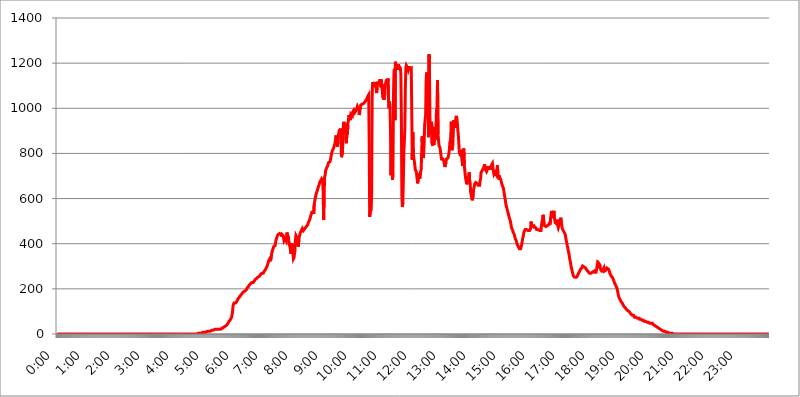
| Category | 2015.06.29. Intenzitás [W/m^2] |
|---|---|
| 0.0 | 0 |
| 0.0006944444444444445 | 0 |
| 0.001388888888888889 | 0 |
| 0.0020833333333333333 | 0 |
| 0.002777777777777778 | 0 |
| 0.003472222222222222 | 0 |
| 0.004166666666666667 | 0 |
| 0.004861111111111111 | 0 |
| 0.005555555555555556 | 0 |
| 0.0062499999999999995 | 0 |
| 0.006944444444444444 | 0 |
| 0.007638888888888889 | 0 |
| 0.008333333333333333 | 0 |
| 0.009027777777777779 | 0 |
| 0.009722222222222222 | 0 |
| 0.010416666666666666 | 0 |
| 0.011111111111111112 | 0 |
| 0.011805555555555555 | 0 |
| 0.012499999999999999 | 0 |
| 0.013194444444444444 | 0 |
| 0.013888888888888888 | 0 |
| 0.014583333333333332 | 0 |
| 0.015277777777777777 | 0 |
| 0.015972222222222224 | 0 |
| 0.016666666666666666 | 0 |
| 0.017361111111111112 | 0 |
| 0.018055555555555557 | 0 |
| 0.01875 | 0 |
| 0.019444444444444445 | 0 |
| 0.02013888888888889 | 0 |
| 0.020833333333333332 | 0 |
| 0.02152777777777778 | 0 |
| 0.022222222222222223 | 0 |
| 0.02291666666666667 | 0 |
| 0.02361111111111111 | 0 |
| 0.024305555555555556 | 0 |
| 0.024999999999999998 | 0 |
| 0.025694444444444447 | 0 |
| 0.02638888888888889 | 0 |
| 0.027083333333333334 | 0 |
| 0.027777777777777776 | 0 |
| 0.02847222222222222 | 0 |
| 0.029166666666666664 | 0 |
| 0.029861111111111113 | 0 |
| 0.030555555555555555 | 0 |
| 0.03125 | 0 |
| 0.03194444444444445 | 0 |
| 0.03263888888888889 | 0 |
| 0.03333333333333333 | 0 |
| 0.034027777777777775 | 0 |
| 0.034722222222222224 | 0 |
| 0.035416666666666666 | 0 |
| 0.036111111111111115 | 0 |
| 0.03680555555555556 | 0 |
| 0.0375 | 0 |
| 0.03819444444444444 | 0 |
| 0.03888888888888889 | 0 |
| 0.03958333333333333 | 0 |
| 0.04027777777777778 | 0 |
| 0.04097222222222222 | 0 |
| 0.041666666666666664 | 0 |
| 0.042361111111111106 | 0 |
| 0.04305555555555556 | 0 |
| 0.043750000000000004 | 0 |
| 0.044444444444444446 | 0 |
| 0.04513888888888889 | 0 |
| 0.04583333333333334 | 0 |
| 0.04652777777777778 | 0 |
| 0.04722222222222222 | 0 |
| 0.04791666666666666 | 0 |
| 0.04861111111111111 | 0 |
| 0.049305555555555554 | 0 |
| 0.049999999999999996 | 0 |
| 0.05069444444444445 | 0 |
| 0.051388888888888894 | 0 |
| 0.052083333333333336 | 0 |
| 0.05277777777777778 | 0 |
| 0.05347222222222222 | 0 |
| 0.05416666666666667 | 0 |
| 0.05486111111111111 | 0 |
| 0.05555555555555555 | 0 |
| 0.05625 | 0 |
| 0.05694444444444444 | 0 |
| 0.057638888888888885 | 0 |
| 0.05833333333333333 | 0 |
| 0.05902777777777778 | 0 |
| 0.059722222222222225 | 0 |
| 0.06041666666666667 | 0 |
| 0.061111111111111116 | 0 |
| 0.06180555555555556 | 0 |
| 0.0625 | 0 |
| 0.06319444444444444 | 0 |
| 0.06388888888888888 | 0 |
| 0.06458333333333334 | 0 |
| 0.06527777777777778 | 0 |
| 0.06597222222222222 | 0 |
| 0.06666666666666667 | 0 |
| 0.06736111111111111 | 0 |
| 0.06805555555555555 | 0 |
| 0.06874999999999999 | 0 |
| 0.06944444444444443 | 0 |
| 0.07013888888888889 | 0 |
| 0.07083333333333333 | 0 |
| 0.07152777777777779 | 0 |
| 0.07222222222222223 | 0 |
| 0.07291666666666667 | 0 |
| 0.07361111111111111 | 0 |
| 0.07430555555555556 | 0 |
| 0.075 | 0 |
| 0.07569444444444444 | 0 |
| 0.0763888888888889 | 0 |
| 0.07708333333333334 | 0 |
| 0.07777777777777778 | 0 |
| 0.07847222222222222 | 0 |
| 0.07916666666666666 | 0 |
| 0.0798611111111111 | 0 |
| 0.08055555555555556 | 0 |
| 0.08125 | 0 |
| 0.08194444444444444 | 0 |
| 0.08263888888888889 | 0 |
| 0.08333333333333333 | 0 |
| 0.08402777777777777 | 0 |
| 0.08472222222222221 | 0 |
| 0.08541666666666665 | 0 |
| 0.08611111111111112 | 0 |
| 0.08680555555555557 | 0 |
| 0.08750000000000001 | 0 |
| 0.08819444444444445 | 0 |
| 0.08888888888888889 | 0 |
| 0.08958333333333333 | 0 |
| 0.09027777777777778 | 0 |
| 0.09097222222222222 | 0 |
| 0.09166666666666667 | 0 |
| 0.09236111111111112 | 0 |
| 0.09305555555555556 | 0 |
| 0.09375 | 0 |
| 0.09444444444444444 | 0 |
| 0.09513888888888888 | 0 |
| 0.09583333333333333 | 0 |
| 0.09652777777777777 | 0 |
| 0.09722222222222222 | 0 |
| 0.09791666666666667 | 0 |
| 0.09861111111111111 | 0 |
| 0.09930555555555555 | 0 |
| 0.09999999999999999 | 0 |
| 0.10069444444444443 | 0 |
| 0.1013888888888889 | 0 |
| 0.10208333333333335 | 0 |
| 0.10277777777777779 | 0 |
| 0.10347222222222223 | 0 |
| 0.10416666666666667 | 0 |
| 0.10486111111111111 | 0 |
| 0.10555555555555556 | 0 |
| 0.10625 | 0 |
| 0.10694444444444444 | 0 |
| 0.1076388888888889 | 0 |
| 0.10833333333333334 | 0 |
| 0.10902777777777778 | 0 |
| 0.10972222222222222 | 0 |
| 0.1111111111111111 | 0 |
| 0.11180555555555556 | 0 |
| 0.11180555555555556 | 0 |
| 0.1125 | 0 |
| 0.11319444444444444 | 0 |
| 0.11388888888888889 | 0 |
| 0.11458333333333333 | 0 |
| 0.11527777777777777 | 0 |
| 0.11597222222222221 | 0 |
| 0.11666666666666665 | 0 |
| 0.1173611111111111 | 0 |
| 0.11805555555555557 | 0 |
| 0.11944444444444445 | 0 |
| 0.12013888888888889 | 0 |
| 0.12083333333333333 | 0 |
| 0.12152777777777778 | 0 |
| 0.12222222222222223 | 0 |
| 0.12291666666666667 | 0 |
| 0.12291666666666667 | 0 |
| 0.12361111111111112 | 0 |
| 0.12430555555555556 | 0 |
| 0.125 | 0 |
| 0.12569444444444444 | 0 |
| 0.12638888888888888 | 0 |
| 0.12708333333333333 | 0 |
| 0.16875 | 0 |
| 0.12847222222222224 | 0 |
| 0.12916666666666668 | 0 |
| 0.12986111111111112 | 0 |
| 0.13055555555555556 | 0 |
| 0.13125 | 0 |
| 0.13194444444444445 | 0 |
| 0.1326388888888889 | 0 |
| 0.13333333333333333 | 0 |
| 0.13402777777777777 | 0 |
| 0.13402777777777777 | 0 |
| 0.13472222222222222 | 0 |
| 0.13541666666666666 | 0 |
| 0.1361111111111111 | 0 |
| 0.13749999999999998 | 0 |
| 0.13819444444444443 | 0 |
| 0.1388888888888889 | 0 |
| 0.13958333333333334 | 0 |
| 0.14027777777777778 | 0 |
| 0.14097222222222222 | 0 |
| 0.14166666666666666 | 0 |
| 0.1423611111111111 | 0 |
| 0.14305555555555557 | 0 |
| 0.14375000000000002 | 0 |
| 0.14444444444444446 | 0 |
| 0.1451388888888889 | 0 |
| 0.1451388888888889 | 0 |
| 0.14652777777777778 | 0 |
| 0.14722222222222223 | 0 |
| 0.14791666666666667 | 0 |
| 0.1486111111111111 | 0 |
| 0.14930555555555555 | 0 |
| 0.15 | 0 |
| 0.15069444444444444 | 0 |
| 0.15138888888888888 | 0 |
| 0.15208333333333332 | 0 |
| 0.15277777777777776 | 0 |
| 0.15347222222222223 | 0 |
| 0.15416666666666667 | 0 |
| 0.15486111111111112 | 0 |
| 0.15555555555555556 | 0 |
| 0.15625 | 0 |
| 0.15694444444444444 | 0 |
| 0.15763888888888888 | 0 |
| 0.15833333333333333 | 0 |
| 0.15902777777777777 | 0 |
| 0.15972222222222224 | 0 |
| 0.16041666666666668 | 0 |
| 0.16111111111111112 | 0 |
| 0.16180555555555556 | 0 |
| 0.1625 | 0 |
| 0.16319444444444445 | 0 |
| 0.1638888888888889 | 0 |
| 0.16458333333333333 | 0 |
| 0.16527777777777777 | 0 |
| 0.16597222222222222 | 0 |
| 0.16666666666666666 | 0 |
| 0.1673611111111111 | 0 |
| 0.16805555555555554 | 0 |
| 0.16874999999999998 | 0 |
| 0.16944444444444443 | 0 |
| 0.17013888888888887 | 0 |
| 0.1708333333333333 | 0 |
| 0.17152777777777775 | 0 |
| 0.17222222222222225 | 0 |
| 0.1729166666666667 | 0 |
| 0.17361111111111113 | 0 |
| 0.17430555555555557 | 0 |
| 0.17500000000000002 | 0 |
| 0.17569444444444446 | 0 |
| 0.1763888888888889 | 0 |
| 0.17708333333333334 | 0 |
| 0.17777777777777778 | 0 |
| 0.17847222222222223 | 0 |
| 0.17916666666666667 | 0 |
| 0.1798611111111111 | 0 |
| 0.18055555555555555 | 0 |
| 0.18125 | 0 |
| 0.18194444444444444 | 0 |
| 0.1826388888888889 | 0 |
| 0.18333333333333335 | 0 |
| 0.1840277777777778 | 0 |
| 0.18472222222222223 | 0 |
| 0.18541666666666667 | 0 |
| 0.18611111111111112 | 0 |
| 0.18680555555555556 | 0 |
| 0.1875 | 0 |
| 0.18819444444444444 | 0 |
| 0.18888888888888888 | 0 |
| 0.18958333333333333 | 0 |
| 0.19027777777777777 | 0 |
| 0.1909722222222222 | 0 |
| 0.19166666666666665 | 0 |
| 0.19236111111111112 | 0 |
| 0.19305555555555554 | 0 |
| 0.19375 | 0 |
| 0.19444444444444445 | 0 |
| 0.1951388888888889 | 3.525 |
| 0.19583333333333333 | 0 |
| 0.19652777777777777 | 3.525 |
| 0.19722222222222222 | 3.525 |
| 0.19791666666666666 | 3.525 |
| 0.1986111111111111 | 3.525 |
| 0.19930555555555554 | 3.525 |
| 0.19999999999999998 | 3.525 |
| 0.20069444444444443 | 3.525 |
| 0.20138888888888887 | 3.525 |
| 0.2020833333333333 | 3.525 |
| 0.2027777777777778 | 3.525 |
| 0.2034722222222222 | 3.525 |
| 0.2041666666666667 | 7.887 |
| 0.20486111111111113 | 3.525 |
| 0.20555555555555557 | 7.887 |
| 0.20625000000000002 | 7.887 |
| 0.20694444444444446 | 7.887 |
| 0.2076388888888889 | 7.887 |
| 0.20833333333333334 | 7.887 |
| 0.20902777777777778 | 7.887 |
| 0.20972222222222223 | 7.887 |
| 0.21041666666666667 | 12.257 |
| 0.2111111111111111 | 12.257 |
| 0.21180555555555555 | 12.257 |
| 0.2125 | 12.257 |
| 0.21319444444444444 | 12.257 |
| 0.2138888888888889 | 12.257 |
| 0.21458333333333335 | 12.257 |
| 0.2152777777777778 | 16.636 |
| 0.21597222222222223 | 16.636 |
| 0.21666666666666667 | 16.636 |
| 0.21736111111111112 | 16.636 |
| 0.21805555555555556 | 16.636 |
| 0.21875 | 16.636 |
| 0.21944444444444444 | 21.024 |
| 0.22013888888888888 | 21.024 |
| 0.22083333333333333 | 21.024 |
| 0.22152777777777777 | 21.024 |
| 0.2222222222222222 | 21.024 |
| 0.22291666666666665 | 21.024 |
| 0.2236111111111111 | 21.024 |
| 0.22430555555555556 | 21.024 |
| 0.225 | 21.024 |
| 0.22569444444444445 | 21.024 |
| 0.2263888888888889 | 21.024 |
| 0.22708333333333333 | 21.024 |
| 0.22777777777777777 | 21.024 |
| 0.22847222222222222 | 21.024 |
| 0.22916666666666666 | 21.024 |
| 0.2298611111111111 | 21.024 |
| 0.23055555555555554 | 25.419 |
| 0.23124999999999998 | 25.419 |
| 0.23194444444444443 | 29.823 |
| 0.23263888888888887 | 29.823 |
| 0.2333333333333333 | 29.823 |
| 0.2340277777777778 | 29.823 |
| 0.2347222222222222 | 29.823 |
| 0.2354166666666667 | 34.234 |
| 0.23611111111111113 | 34.234 |
| 0.23680555555555557 | 38.653 |
| 0.23750000000000002 | 38.653 |
| 0.23819444444444446 | 43.079 |
| 0.2388888888888889 | 43.079 |
| 0.23958333333333334 | 47.511 |
| 0.24027777777777778 | 51.951 |
| 0.24097222222222223 | 56.398 |
| 0.24166666666666667 | 56.398 |
| 0.2423611111111111 | 60.85 |
| 0.24305555555555555 | 65.31 |
| 0.24375 | 65.31 |
| 0.24444444444444446 | 74.246 |
| 0.24513888888888888 | 83.205 |
| 0.24583333333333335 | 96.682 |
| 0.2465277777777778 | 123.758 |
| 0.24722222222222223 | 132.814 |
| 0.24791666666666667 | 137.347 |
| 0.24861111111111112 | 137.347 |
| 0.24930555555555556 | 137.347 |
| 0.25 | 137.347 |
| 0.25069444444444444 | 137.347 |
| 0.2513888888888889 | 141.884 |
| 0.2520833333333333 | 146.423 |
| 0.25277777777777777 | 150.964 |
| 0.2534722222222222 | 155.509 |
| 0.25416666666666665 | 155.509 |
| 0.2548611111111111 | 160.056 |
| 0.2555555555555556 | 164.605 |
| 0.25625000000000003 | 164.605 |
| 0.2569444444444445 | 169.156 |
| 0.2576388888888889 | 173.709 |
| 0.25833333333333336 | 173.709 |
| 0.2590277777777778 | 178.264 |
| 0.25972222222222224 | 182.82 |
| 0.2604166666666667 | 182.82 |
| 0.2611111111111111 | 182.82 |
| 0.26180555555555557 | 187.378 |
| 0.2625 | 187.378 |
| 0.26319444444444445 | 187.378 |
| 0.2638888888888889 | 191.937 |
| 0.26458333333333334 | 191.937 |
| 0.2652777777777778 | 196.497 |
| 0.2659722222222222 | 201.058 |
| 0.26666666666666666 | 205.62 |
| 0.2673611111111111 | 205.62 |
| 0.26805555555555555 | 210.182 |
| 0.26875 | 214.746 |
| 0.26944444444444443 | 214.746 |
| 0.2701388888888889 | 219.309 |
| 0.2708333333333333 | 219.309 |
| 0.27152777777777776 | 223.873 |
| 0.2722222222222222 | 223.873 |
| 0.27291666666666664 | 228.436 |
| 0.2736111111111111 | 228.436 |
| 0.2743055555555555 | 228.436 |
| 0.27499999999999997 | 228.436 |
| 0.27569444444444446 | 233 |
| 0.27638888888888885 | 233 |
| 0.27708333333333335 | 237.564 |
| 0.2777777777777778 | 242.127 |
| 0.27847222222222223 | 242.127 |
| 0.2791666666666667 | 242.127 |
| 0.2798611111111111 | 246.689 |
| 0.28055555555555556 | 246.689 |
| 0.28125 | 251.251 |
| 0.28194444444444444 | 251.251 |
| 0.2826388888888889 | 251.251 |
| 0.2833333333333333 | 255.813 |
| 0.28402777777777777 | 255.813 |
| 0.2847222222222222 | 260.373 |
| 0.28541666666666665 | 264.932 |
| 0.28611111111111115 | 264.932 |
| 0.28680555555555554 | 269.49 |
| 0.28750000000000003 | 269.49 |
| 0.2881944444444445 | 269.49 |
| 0.2888888888888889 | 269.49 |
| 0.28958333333333336 | 274.047 |
| 0.2902777777777778 | 278.603 |
| 0.29097222222222224 | 278.603 |
| 0.2916666666666667 | 283.156 |
| 0.2923611111111111 | 287.709 |
| 0.29305555555555557 | 292.259 |
| 0.29375 | 296.808 |
| 0.29444444444444445 | 301.354 |
| 0.2951388888888889 | 310.44 |
| 0.29583333333333334 | 314.98 |
| 0.2965277777777778 | 324.052 |
| 0.2972222222222222 | 328.584 |
| 0.29791666666666666 | 333.113 |
| 0.2986111111111111 | 333.113 |
| 0.29930555555555555 | 328.584 |
| 0.3 | 333.113 |
| 0.30069444444444443 | 355.712 |
| 0.3013888888888889 | 364.728 |
| 0.3020833333333333 | 373.729 |
| 0.30277777777777776 | 378.224 |
| 0.3034722222222222 | 387.202 |
| 0.30416666666666664 | 387.202 |
| 0.3048611111111111 | 387.202 |
| 0.3055555555555555 | 391.685 |
| 0.30624999999999997 | 405.108 |
| 0.3069444444444444 | 418.492 |
| 0.3076388888888889 | 422.943 |
| 0.30833333333333335 | 431.833 |
| 0.3090277777777778 | 431.833 |
| 0.30972222222222223 | 440.702 |
| 0.3104166666666667 | 445.129 |
| 0.3111111111111111 | 445.129 |
| 0.31180555555555556 | 445.129 |
| 0.3125 | 440.702 |
| 0.31319444444444444 | 445.129 |
| 0.3138888888888889 | 440.702 |
| 0.3145833333333333 | 431.833 |
| 0.31527777777777777 | 440.702 |
| 0.3159722222222222 | 445.129 |
| 0.31666666666666665 | 436.27 |
| 0.31736111111111115 | 427.39 |
| 0.31805555555555554 | 414.035 |
| 0.31875000000000003 | 418.492 |
| 0.3194444444444445 | 422.943 |
| 0.3201388888888889 | 422.943 |
| 0.32083333333333336 | 414.035 |
| 0.3215277777777778 | 431.833 |
| 0.32222222222222224 | 449.551 |
| 0.3229166666666667 | 449.551 |
| 0.3236111111111111 | 453.968 |
| 0.32430555555555557 | 422.943 |
| 0.325 | 396.164 |
| 0.32569444444444445 | 405.108 |
| 0.3263888888888889 | 387.202 |
| 0.32708333333333334 | 369.23 |
| 0.3277777777777778 | 355.712 |
| 0.3284722222222222 | 369.23 |
| 0.32916666666666666 | 400.638 |
| 0.3298611111111111 | 378.224 |
| 0.33055555555555555 | 355.712 |
| 0.33125 | 333.113 |
| 0.33194444444444443 | 337.639 |
| 0.3326388888888889 | 351.198 |
| 0.3333333333333333 | 369.23 |
| 0.3340277777777778 | 414.035 |
| 0.3347222222222222 | 436.27 |
| 0.3354166666666667 | 431.833 |
| 0.3361111111111111 | 422.943 |
| 0.3368055555555556 | 422.943 |
| 0.33749999999999997 | 405.108 |
| 0.33819444444444446 | 387.202 |
| 0.33888888888888885 | 422.943 |
| 0.33958333333333335 | 431.833 |
| 0.34027777777777773 | 431.833 |
| 0.34097222222222223 | 449.551 |
| 0.3416666666666666 | 453.968 |
| 0.3423611111111111 | 458.38 |
| 0.3430555555555555 | 458.38 |
| 0.34375 | 467.187 |
| 0.3444444444444445 | 462.786 |
| 0.3451388888888889 | 458.38 |
| 0.3458333333333334 | 462.786 |
| 0.34652777777777777 | 462.786 |
| 0.34722222222222227 | 467.187 |
| 0.34791666666666665 | 471.582 |
| 0.34861111111111115 | 471.582 |
| 0.34930555555555554 | 475.972 |
| 0.35000000000000003 | 480.356 |
| 0.3506944444444444 | 480.356 |
| 0.3513888888888889 | 484.735 |
| 0.3520833333333333 | 493.475 |
| 0.3527777777777778 | 497.836 |
| 0.3534722222222222 | 502.192 |
| 0.3541666666666667 | 506.542 |
| 0.3548611111111111 | 515.223 |
| 0.35555555555555557 | 523.88 |
| 0.35625 | 528.2 |
| 0.35694444444444445 | 536.82 |
| 0.3576388888888889 | 545.416 |
| 0.35833333333333334 | 532.513 |
| 0.3590277777777778 | 545.416 |
| 0.3597222222222222 | 532.513 |
| 0.36041666666666666 | 575.299 |
| 0.3611111111111111 | 588.009 |
| 0.36180555555555555 | 600.661 |
| 0.3625 | 613.252 |
| 0.36319444444444443 | 621.613 |
| 0.3638888888888889 | 625.784 |
| 0.3645833333333333 | 634.105 |
| 0.3652777777777778 | 642.4 |
| 0.3659722222222222 | 646.537 |
| 0.3666666666666667 | 654.791 |
| 0.3673611111111111 | 663.019 |
| 0.3680555555555556 | 671.22 |
| 0.36874999999999997 | 675.311 |
| 0.36944444444444446 | 679.395 |
| 0.37013888888888885 | 683.473 |
| 0.37083333333333335 | 687.544 |
| 0.37152777777777773 | 691.608 |
| 0.37222222222222223 | 679.395 |
| 0.3729166666666666 | 634.105 |
| 0.3736111111111111 | 506.542 |
| 0.3743055555555555 | 613.252 |
| 0.375 | 695.666 |
| 0.3756944444444445 | 703.762 |
| 0.3763888888888889 | 723.889 |
| 0.3770833333333334 | 727.896 |
| 0.37777777777777777 | 735.89 |
| 0.37847222222222227 | 735.89 |
| 0.37916666666666665 | 743.859 |
| 0.37986111111111115 | 751.803 |
| 0.38055555555555554 | 759.723 |
| 0.38125000000000003 | 759.723 |
| 0.3819444444444444 | 759.723 |
| 0.3826388888888889 | 763.674 |
| 0.3833333333333333 | 775.492 |
| 0.3840277777777778 | 787.258 |
| 0.3847222222222222 | 798.974 |
| 0.3854166666666667 | 806.757 |
| 0.3861111111111111 | 814.519 |
| 0.38680555555555557 | 818.392 |
| 0.3875 | 822.26 |
| 0.38819444444444445 | 829.981 |
| 0.3888888888888889 | 833.834 |
| 0.38958333333333334 | 845.365 |
| 0.3902777777777778 | 860.676 |
| 0.3909722222222222 | 879.719 |
| 0.39166666666666666 | 868.305 |
| 0.3923611111111111 | 872.114 |
| 0.39305555555555555 | 829.981 |
| 0.39375 | 872.114 |
| 0.39444444444444443 | 868.305 |
| 0.3951388888888889 | 894.885 |
| 0.3958333333333333 | 906.223 |
| 0.3965277777777778 | 883.516 |
| 0.3972222222222222 | 909.996 |
| 0.3979166666666667 | 868.305 |
| 0.3986111111111111 | 783.342 |
| 0.3993055555555556 | 791.169 |
| 0.39999999999999997 | 798.974 |
| 0.40069444444444446 | 868.305 |
| 0.40138888888888885 | 928.819 |
| 0.40208333333333335 | 940.082 |
| 0.40277777777777773 | 921.298 |
| 0.40347222222222223 | 928.819 |
| 0.4041666666666666 | 913.766 |
| 0.4048611111111111 | 853.029 |
| 0.4055555555555555 | 845.365 |
| 0.40625 | 894.885 |
| 0.4069444444444445 | 883.516 |
| 0.4076388888888889 | 936.33 |
| 0.4083333333333334 | 943.832 |
| 0.40902777777777777 | 970.034 |
| 0.40972222222222227 | 970.034 |
| 0.41041666666666665 | 955.071 |
| 0.41111111111111115 | 947.58 |
| 0.41180555555555554 | 973.772 |
| 0.41250000000000003 | 977.508 |
| 0.4131944444444444 | 970.034 |
| 0.4138888888888889 | 966.295 |
| 0.4145833333333333 | 984.98 |
| 0.4152777777777778 | 984.98 |
| 0.4159722222222222 | 992.448 |
| 0.4166666666666667 | 992.448 |
| 0.4173611111111111 | 981.244 |
| 0.41805555555555557 | 977.508 |
| 0.41875 | 984.98 |
| 0.41944444444444445 | 992.448 |
| 0.4201388888888889 | 999.916 |
| 0.42083333333333334 | 992.448 |
| 0.4215277777777778 | 1003.65 |
| 0.4222222222222222 | 999.916 |
| 0.42291666666666666 | 992.448 |
| 0.4236111111111111 | 970.034 |
| 0.42430555555555555 | 988.714 |
| 0.425 | 996.182 |
| 0.42569444444444443 | 1014.852 |
| 0.4263888888888889 | 1011.118 |
| 0.4270833333333333 | 1014.852 |
| 0.4277777777777778 | 1018.587 |
| 0.4284722222222222 | 1018.587 |
| 0.4291666666666667 | 1014.852 |
| 0.4298611111111111 | 1022.323 |
| 0.4305555555555556 | 1022.323 |
| 0.43124999999999997 | 1026.06 |
| 0.43194444444444446 | 1029.798 |
| 0.43263888888888885 | 1033.537 |
| 0.43333333333333335 | 1033.537 |
| 0.43402777777777773 | 1041.019 |
| 0.43472222222222223 | 1044.762 |
| 0.4354166666666666 | 1052.255 |
| 0.4361111111111111 | 1056.004 |
| 0.4368055555555555 | 1059.756 |
| 0.4375 | 853.029 |
| 0.4381944444444445 | 519.555 |
| 0.4388888888888889 | 541.121 |
| 0.4395833333333334 | 545.416 |
| 0.44027777777777777 | 549.704 |
| 0.44097222222222227 | 621.613 |
| 0.44166666666666665 | 1052.255 |
| 0.44236111111111115 | 1116.426 |
| 0.44305555555555554 | 1116.426 |
| 0.44375000000000003 | 1101.226 |
| 0.4444444444444444 | 1101.226 |
| 0.4451388888888889 | 1105.019 |
| 0.4458333333333333 | 1101.226 |
| 0.4465277777777778 | 1116.426 |
| 0.4472222222222222 | 1089.873 |
| 0.4479166666666667 | 1067.267 |
| 0.4486111111111111 | 1093.653 |
| 0.44930555555555557 | 1112.618 |
| 0.45 | 1116.426 |
| 0.45069444444444445 | 1108.816 |
| 0.4513888888888889 | 1112.618 |
| 0.45208333333333334 | 1105.019 |
| 0.4527777777777778 | 1127.879 |
| 0.4534722222222222 | 1093.653 |
| 0.45416666666666666 | 1127.879 |
| 0.4548611111111111 | 1093.653 |
| 0.45555555555555555 | 1108.816 |
| 0.45625 | 1063.51 |
| 0.45694444444444443 | 1044.762 |
| 0.4576388888888889 | 1059.756 |
| 0.4583333333333333 | 1037.277 |
| 0.4590277777777778 | 1078.555 |
| 0.4597222222222222 | 1093.653 |
| 0.4604166666666667 | 1108.816 |
| 0.4611111111111111 | 1116.426 |
| 0.4618055555555556 | 1127.879 |
| 0.46249999999999997 | 1127.879 |
| 0.46319444444444446 | 1112.618 |
| 0.46388888888888885 | 1131.708 |
| 0.46458333333333335 | 1033.537 |
| 0.46527777777777773 | 999.916 |
| 0.46597222222222223 | 1029.798 |
| 0.4666666666666666 | 999.916 |
| 0.4673611111111111 | 913.766 |
| 0.4680555555555555 | 703.762 |
| 0.46875 | 841.526 |
| 0.4694444444444445 | 806.757 |
| 0.4701388888888889 | 683.473 |
| 0.4708333333333334 | 707.8 |
| 0.47152777777777777 | 1048.508 |
| 0.47222222222222227 | 1154.814 |
| 0.47291666666666665 | 1174.263 |
| 0.47361111111111115 | 947.58 |
| 0.47430555555555554 | 1205.82 |
| 0.47500000000000003 | 1201.843 |
| 0.4756944444444444 | 1174.263 |
| 0.4763888888888889 | 1193.918 |
| 0.4770833333333333 | 1170.358 |
| 0.4777777777777778 | 1174.263 |
| 0.4784722222222222 | 1193.918 |
| 0.4791666666666667 | 1186.03 |
| 0.4798611111111111 | 1182.099 |
| 0.48055555555555557 | 1186.03 |
| 0.48125 | 1178.177 |
| 0.48194444444444445 | 1150.946 |
| 0.4826388888888889 | 962.555 |
| 0.48333333333333334 | 613.252 |
| 0.4840277777777778 | 562.53 |
| 0.4847222222222222 | 583.779 |
| 0.48541666666666666 | 683.473 |
| 0.4861111111111111 | 806.757 |
| 0.48680555555555555 | 853.029 |
| 0.4875 | 902.447 |
| 0.48819444444444443 | 1082.324 |
| 0.4888888888888889 | 1178.177 |
| 0.4895833333333333 | 1189.969 |
| 0.4902777777777778 | 1186.03 |
| 0.4909722222222222 | 1186.03 |
| 0.4916666666666667 | 1178.177 |
| 0.4923611111111111 | 1170.358 |
| 0.4930555555555556 | 1178.177 |
| 0.49374999999999997 | 1186.03 |
| 0.49444444444444446 | 1174.263 |
| 0.49513888888888885 | 1170.358 |
| 0.49583333333333335 | 1174.263 |
| 0.49652777777777773 | 1178.177 |
| 0.49722222222222223 | 977.508 |
| 0.4979166666666666 | 771.559 |
| 0.4986111111111111 | 894.885 |
| 0.4993055555555555 | 802.868 |
| 0.5 | 783.342 |
| 0.5006944444444444 | 787.258 |
| 0.5013888888888889 | 751.803 |
| 0.5020833333333333 | 727.896 |
| 0.5027777777777778 | 723.889 |
| 0.5034722222222222 | 719.877 |
| 0.5041666666666667 | 703.762 |
| 0.5048611111111111 | 683.473 |
| 0.5055555555555555 | 667.123 |
| 0.50625 | 667.123 |
| 0.5069444444444444 | 711.832 |
| 0.5076388888888889 | 707.8 |
| 0.5083333333333333 | 687.544 |
| 0.5090277777777777 | 687.544 |
| 0.5097222222222222 | 719.877 |
| 0.5104166666666666 | 727.896 |
| 0.5111111111111112 | 802.868 |
| 0.5118055555555555 | 875.918 |
| 0.5125000000000001 | 818.392 |
| 0.5131944444444444 | 779.42 |
| 0.513888888888889 | 795.074 |
| 0.5145833333333333 | 845.365 |
| 0.5152777777777778 | 925.06 |
| 0.5159722222222222 | 925.06 |
| 0.5166666666666667 | 970.034 |
| 0.517361111111111 | 1116.426 |
| 0.5180555555555556 | 1158.689 |
| 0.5187499999999999 | 1086.097 |
| 0.5194444444444445 | 1135.543 |
| 0.5201388888888888 | 973.772 |
| 0.5208333333333334 | 872.114 |
| 0.5215277777777778 | 1238.014 |
| 0.5222222222222223 | 1120.238 |
| 0.5229166666666667 | 887.309 |
| 0.5236111111111111 | 887.309 |
| 0.5243055555555556 | 932.576 |
| 0.525 | 940.082 |
| 0.5256944444444445 | 845.365 |
| 0.5263888888888889 | 833.834 |
| 0.5270833333333333 | 853.029 |
| 0.5277777777777778 | 853.029 |
| 0.5284722222222222 | 837.682 |
| 0.5291666666666667 | 917.534 |
| 0.5298611111111111 | 860.676 |
| 0.5305555555555556 | 868.305 |
| 0.53125 | 928.819 |
| 0.5319444444444444 | 996.182 |
| 0.5326388888888889 | 928.819 |
| 0.5333333333333333 | 1124.056 |
| 0.5340277777777778 | 883.516 |
| 0.5347222222222222 | 860.676 |
| 0.5354166666666667 | 833.834 |
| 0.5361111111111111 | 837.682 |
| 0.5368055555555555 | 826.123 |
| 0.5375 | 822.26 |
| 0.5381944444444444 | 791.169 |
| 0.5388888888888889 | 775.492 |
| 0.5395833333333333 | 771.559 |
| 0.5402777777777777 | 775.492 |
| 0.5409722222222222 | 775.492 |
| 0.5416666666666666 | 771.559 |
| 0.5423611111111112 | 763.674 |
| 0.5430555555555555 | 751.803 |
| 0.5437500000000001 | 739.877 |
| 0.5444444444444444 | 739.877 |
| 0.545138888888889 | 759.723 |
| 0.5458333333333333 | 775.492 |
| 0.5465277777777778 | 779.42 |
| 0.5472222222222222 | 779.42 |
| 0.5479166666666667 | 779.42 |
| 0.548611111111111 | 783.342 |
| 0.5493055555555556 | 798.974 |
| 0.5499999999999999 | 818.392 |
| 0.5506944444444445 | 849.199 |
| 0.5513888888888888 | 856.855 |
| 0.5520833333333334 | 849.199 |
| 0.5527777777777778 | 940.082 |
| 0.5534722222222223 | 814.519 |
| 0.5541666666666667 | 810.641 |
| 0.5548611111111111 | 841.526 |
| 0.5555555555555556 | 902.447 |
| 0.55625 | 947.58 |
| 0.5569444444444445 | 925.06 |
| 0.5576388888888889 | 932.576 |
| 0.5583333333333333 | 913.766 |
| 0.5590277777777778 | 909.996 |
| 0.5597222222222222 | 966.295 |
| 0.5604166666666667 | 955.071 |
| 0.5611111111111111 | 936.33 |
| 0.5618055555555556 | 902.447 |
| 0.5625 | 883.516 |
| 0.5631944444444444 | 879.719 |
| 0.5638888888888889 | 806.757 |
| 0.5645833333333333 | 798.974 |
| 0.5652777777777778 | 802.868 |
| 0.5659722222222222 | 795.074 |
| 0.5666666666666667 | 806.757 |
| 0.5673611111111111 | 775.492 |
| 0.5680555555555555 | 759.723 |
| 0.56875 | 743.859 |
| 0.5694444444444444 | 783.342 |
| 0.5701388888888889 | 822.26 |
| 0.5708333333333333 | 751.803 |
| 0.5715277777777777 | 727.896 |
| 0.5722222222222222 | 703.762 |
| 0.5729166666666666 | 687.544 |
| 0.5736111111111112 | 675.311 |
| 0.5743055555555555 | 663.019 |
| 0.5750000000000001 | 658.909 |
| 0.5756944444444444 | 675.311 |
| 0.576388888888889 | 675.311 |
| 0.5770833333333333 | 699.717 |
| 0.5777777777777778 | 715.858 |
| 0.5784722222222222 | 675.311 |
| 0.5791666666666667 | 667.123 |
| 0.579861111111111 | 625.784 |
| 0.5805555555555556 | 617.436 |
| 0.5812499999999999 | 604.864 |
| 0.5819444444444445 | 592.233 |
| 0.5826388888888888 | 596.45 |
| 0.5833333333333334 | 613.252 |
| 0.5840277777777778 | 642.4 |
| 0.5847222222222223 | 650.667 |
| 0.5854166666666667 | 663.019 |
| 0.5861111111111111 | 667.123 |
| 0.5868055555555556 | 671.22 |
| 0.5875 | 675.311 |
| 0.5881944444444445 | 675.311 |
| 0.5888888888888889 | 667.123 |
| 0.5895833333333333 | 663.019 |
| 0.5902777777777778 | 658.909 |
| 0.5909722222222222 | 658.909 |
| 0.5916666666666667 | 658.909 |
| 0.5923611111111111 | 658.909 |
| 0.5930555555555556 | 679.395 |
| 0.59375 | 687.544 |
| 0.5944444444444444 | 715.858 |
| 0.5951388888888889 | 719.877 |
| 0.5958333333333333 | 723.889 |
| 0.5965277777777778 | 727.896 |
| 0.5972222222222222 | 723.889 |
| 0.5979166666666667 | 735.89 |
| 0.5986111111111111 | 743.859 |
| 0.5993055555555555 | 751.803 |
| 0.6 | 735.89 |
| 0.6006944444444444 | 727.896 |
| 0.6013888888888889 | 723.889 |
| 0.6020833333333333 | 719.877 |
| 0.6027777777777777 | 719.877 |
| 0.6034722222222222 | 731.896 |
| 0.6041666666666666 | 743.859 |
| 0.6048611111111112 | 735.89 |
| 0.6055555555555555 | 727.896 |
| 0.6062500000000001 | 739.877 |
| 0.6069444444444444 | 727.896 |
| 0.607638888888889 | 735.89 |
| 0.6083333333333333 | 739.877 |
| 0.6090277777777778 | 747.834 |
| 0.6097222222222222 | 751.803 |
| 0.6104166666666667 | 755.766 |
| 0.611111111111111 | 735.89 |
| 0.6118055555555556 | 719.877 |
| 0.6124999999999999 | 707.8 |
| 0.6131944444444445 | 703.762 |
| 0.6138888888888888 | 715.858 |
| 0.6145833333333334 | 719.877 |
| 0.6152777777777778 | 719.877 |
| 0.6159722222222223 | 703.762 |
| 0.6166666666666667 | 723.889 |
| 0.6173611111111111 | 747.834 |
| 0.6180555555555556 | 699.717 |
| 0.61875 | 691.608 |
| 0.6194444444444445 | 703.762 |
| 0.6201388888888889 | 683.473 |
| 0.6208333333333333 | 691.608 |
| 0.6215277777777778 | 687.544 |
| 0.6222222222222222 | 683.473 |
| 0.6229166666666667 | 671.22 |
| 0.6236111111111111 | 663.019 |
| 0.6243055555555556 | 658.909 |
| 0.625 | 663.019 |
| 0.6256944444444444 | 646.537 |
| 0.6263888888888889 | 634.105 |
| 0.6270833333333333 | 617.436 |
| 0.6277777777777778 | 604.864 |
| 0.6284722222222222 | 592.233 |
| 0.6291666666666667 | 575.299 |
| 0.6298611111111111 | 566.793 |
| 0.6305555555555555 | 558.261 |
| 0.63125 | 549.704 |
| 0.6319444444444444 | 541.121 |
| 0.6326388888888889 | 532.513 |
| 0.6333333333333333 | 523.88 |
| 0.6340277777777777 | 515.223 |
| 0.6347222222222222 | 510.885 |
| 0.6354166666666666 | 502.192 |
| 0.6361111111111112 | 489.108 |
| 0.6368055555555555 | 475.972 |
| 0.6375000000000001 | 467.187 |
| 0.6381944444444444 | 462.786 |
| 0.638888888888889 | 458.38 |
| 0.6395833333333333 | 449.551 |
| 0.6402777777777778 | 445.129 |
| 0.6409722222222222 | 440.702 |
| 0.6416666666666667 | 431.833 |
| 0.642361111111111 | 422.943 |
| 0.6430555555555556 | 418.492 |
| 0.6437499999999999 | 414.035 |
| 0.6444444444444445 | 405.108 |
| 0.6451388888888888 | 396.164 |
| 0.6458333333333334 | 391.685 |
| 0.6465277777777778 | 387.202 |
| 0.6472222222222223 | 382.715 |
| 0.6479166666666667 | 378.224 |
| 0.6486111111111111 | 378.224 |
| 0.6493055555555556 | 378.224 |
| 0.65 | 378.224 |
| 0.6506944444444445 | 387.202 |
| 0.6513888888888889 | 396.164 |
| 0.6520833333333333 | 409.574 |
| 0.6527777777777778 | 422.943 |
| 0.6534722222222222 | 431.833 |
| 0.6541666666666667 | 445.129 |
| 0.6548611111111111 | 453.968 |
| 0.6555555555555556 | 458.38 |
| 0.65625 | 462.786 |
| 0.6569444444444444 | 462.786 |
| 0.6576388888888889 | 462.786 |
| 0.6583333333333333 | 462.786 |
| 0.6590277777777778 | 462.786 |
| 0.6597222222222222 | 462.786 |
| 0.6604166666666667 | 458.38 |
| 0.6611111111111111 | 458.38 |
| 0.6618055555555555 | 458.38 |
| 0.6625 | 458.38 |
| 0.6631944444444444 | 462.786 |
| 0.6638888888888889 | 467.187 |
| 0.6645833333333333 | 497.836 |
| 0.6652777777777777 | 480.356 |
| 0.6659722222222222 | 484.735 |
| 0.6666666666666666 | 475.972 |
| 0.6673611111111111 | 475.972 |
| 0.6680555555555556 | 484.735 |
| 0.6687500000000001 | 475.972 |
| 0.6694444444444444 | 471.582 |
| 0.6701388888888888 | 475.972 |
| 0.6708333333333334 | 471.582 |
| 0.6715277777777778 | 467.187 |
| 0.6722222222222222 | 462.786 |
| 0.6729166666666666 | 462.786 |
| 0.6736111111111112 | 462.786 |
| 0.6743055555555556 | 462.786 |
| 0.6749999999999999 | 458.38 |
| 0.6756944444444444 | 458.38 |
| 0.6763888888888889 | 458.38 |
| 0.6770833333333334 | 453.968 |
| 0.6777777777777777 | 458.38 |
| 0.6784722222222223 | 458.38 |
| 0.6791666666666667 | 480.356 |
| 0.6798611111111111 | 497.836 |
| 0.6805555555555555 | 506.542 |
| 0.68125 | 528.2 |
| 0.6819444444444445 | 519.555 |
| 0.6826388888888889 | 497.836 |
| 0.6833333333333332 | 480.356 |
| 0.6840277777777778 | 480.356 |
| 0.6847222222222222 | 475.972 |
| 0.6854166666666667 | 475.972 |
| 0.686111111111111 | 475.972 |
| 0.6868055555555556 | 475.972 |
| 0.6875 | 480.356 |
| 0.6881944444444444 | 480.356 |
| 0.688888888888889 | 484.735 |
| 0.6895833333333333 | 484.735 |
| 0.6902777777777778 | 493.475 |
| 0.6909722222222222 | 484.735 |
| 0.6916666666666668 | 489.108 |
| 0.6923611111111111 | 519.555 |
| 0.6930555555555555 | 545.416 |
| 0.69375 | 515.223 |
| 0.6944444444444445 | 528.2 |
| 0.6951388888888889 | 541.121 |
| 0.6958333333333333 | 532.513 |
| 0.6965277777777777 | 545.416 |
| 0.6972222222222223 | 515.223 |
| 0.6979166666666666 | 502.192 |
| 0.6986111111111111 | 489.108 |
| 0.6993055555555556 | 489.108 |
| 0.7000000000000001 | 502.192 |
| 0.7006944444444444 | 484.735 |
| 0.7013888888888888 | 506.542 |
| 0.7020833333333334 | 480.356 |
| 0.7027777777777778 | 471.582 |
| 0.7034722222222222 | 471.582 |
| 0.7041666666666666 | 475.972 |
| 0.7048611111111112 | 493.475 |
| 0.7055555555555556 | 489.108 |
| 0.7062499999999999 | 515.223 |
| 0.7069444444444444 | 493.475 |
| 0.7076388888888889 | 497.836 |
| 0.7083333333333334 | 467.187 |
| 0.7090277777777777 | 462.786 |
| 0.7097222222222223 | 458.38 |
| 0.7104166666666667 | 453.968 |
| 0.7111111111111111 | 449.551 |
| 0.7118055555555555 | 449.551 |
| 0.7125 | 440.702 |
| 0.7131944444444445 | 427.39 |
| 0.7138888888888889 | 414.035 |
| 0.7145833333333332 | 405.108 |
| 0.7152777777777778 | 391.685 |
| 0.7159722222222222 | 382.715 |
| 0.7166666666666667 | 369.23 |
| 0.717361111111111 | 360.221 |
| 0.7180555555555556 | 346.682 |
| 0.71875 | 333.113 |
| 0.7194444444444444 | 324.052 |
| 0.720138888888889 | 310.44 |
| 0.7208333333333333 | 296.808 |
| 0.7215277777777778 | 287.709 |
| 0.7222222222222222 | 278.603 |
| 0.7229166666666668 | 269.49 |
| 0.7236111111111111 | 260.373 |
| 0.7243055555555555 | 255.813 |
| 0.725 | 255.813 |
| 0.7256944444444445 | 251.251 |
| 0.7263888888888889 | 251.251 |
| 0.7270833333333333 | 251.251 |
| 0.7277777777777777 | 251.251 |
| 0.7284722222222223 | 251.251 |
| 0.7291666666666666 | 255.813 |
| 0.7298611111111111 | 260.373 |
| 0.7305555555555556 | 264.932 |
| 0.7312500000000001 | 269.49 |
| 0.7319444444444444 | 274.047 |
| 0.7326388888888888 | 278.603 |
| 0.7333333333333334 | 283.156 |
| 0.7340277777777778 | 287.709 |
| 0.7347222222222222 | 287.709 |
| 0.7354166666666666 | 292.259 |
| 0.7361111111111112 | 296.808 |
| 0.7368055555555556 | 301.354 |
| 0.7374999999999999 | 301.354 |
| 0.7381944444444444 | 301.354 |
| 0.7388888888888889 | 296.808 |
| 0.7395833333333334 | 296.808 |
| 0.7402777777777777 | 296.808 |
| 0.7409722222222223 | 292.259 |
| 0.7416666666666667 | 287.709 |
| 0.7423611111111111 | 287.709 |
| 0.7430555555555555 | 283.156 |
| 0.74375 | 278.603 |
| 0.7444444444444445 | 278.603 |
| 0.7451388888888889 | 274.047 |
| 0.7458333333333332 | 274.047 |
| 0.7465277777777778 | 269.49 |
| 0.7472222222222222 | 269.49 |
| 0.7479166666666667 | 269.49 |
| 0.748611111111111 | 269.49 |
| 0.7493055555555556 | 269.49 |
| 0.75 | 269.49 |
| 0.7506944444444444 | 274.047 |
| 0.751388888888889 | 274.047 |
| 0.7520833333333333 | 274.047 |
| 0.7527777777777778 | 278.603 |
| 0.7534722222222222 | 274.047 |
| 0.7541666666666668 | 274.047 |
| 0.7548611111111111 | 274.047 |
| 0.7555555555555555 | 274.047 |
| 0.75625 | 283.156 |
| 0.7569444444444445 | 296.808 |
| 0.7576388888888889 | 310.44 |
| 0.7583333333333333 | 305.898 |
| 0.7590277777777777 | 314.98 |
| 0.7597222222222223 | 314.98 |
| 0.7604166666666666 | 314.98 |
| 0.7611111111111111 | 305.898 |
| 0.7618055555555556 | 292.259 |
| 0.7625000000000001 | 283.156 |
| 0.7631944444444444 | 283.156 |
| 0.7638888888888888 | 278.603 |
| 0.7645833333333334 | 278.603 |
| 0.7652777777777778 | 283.156 |
| 0.7659722222222222 | 287.709 |
| 0.7666666666666666 | 292.259 |
| 0.7673611111111112 | 278.603 |
| 0.7680555555555556 | 278.603 |
| 0.7687499999999999 | 278.603 |
| 0.7694444444444444 | 283.156 |
| 0.7701388888888889 | 287.709 |
| 0.7708333333333334 | 292.259 |
| 0.7715277777777777 | 292.259 |
| 0.7722222222222223 | 292.259 |
| 0.7729166666666667 | 287.709 |
| 0.7736111111111111 | 283.156 |
| 0.7743055555555555 | 278.603 |
| 0.775 | 269.49 |
| 0.7756944444444445 | 264.932 |
| 0.7763888888888889 | 260.373 |
| 0.7770833333333332 | 255.813 |
| 0.7777777777777778 | 255.813 |
| 0.7784722222222222 | 251.251 |
| 0.7791666666666667 | 246.689 |
| 0.779861111111111 | 242.127 |
| 0.7805555555555556 | 237.564 |
| 0.78125 | 228.436 |
| 0.7819444444444444 | 223.873 |
| 0.782638888888889 | 219.309 |
| 0.7833333333333333 | 214.746 |
| 0.7840277777777778 | 210.182 |
| 0.7847222222222222 | 205.62 |
| 0.7854166666666668 | 196.497 |
| 0.7861111111111111 | 187.378 |
| 0.7868055555555555 | 173.709 |
| 0.7875 | 164.605 |
| 0.7881944444444445 | 160.056 |
| 0.7888888888888889 | 155.509 |
| 0.7895833333333333 | 150.964 |
| 0.7902777777777777 | 146.423 |
| 0.7909722222222223 | 141.884 |
| 0.7916666666666666 | 141.884 |
| 0.7923611111111111 | 137.347 |
| 0.7930555555555556 | 132.814 |
| 0.7937500000000001 | 128.284 |
| 0.7944444444444444 | 123.758 |
| 0.7951388888888888 | 123.758 |
| 0.7958333333333334 | 119.235 |
| 0.7965277777777778 | 119.235 |
| 0.7972222222222222 | 114.716 |
| 0.7979166666666666 | 110.201 |
| 0.7986111111111112 | 110.201 |
| 0.7993055555555556 | 105.69 |
| 0.7999999999999999 | 105.69 |
| 0.8006944444444444 | 105.69 |
| 0.8013888888888889 | 101.184 |
| 0.8020833333333334 | 101.184 |
| 0.8027777777777777 | 96.682 |
| 0.8034722222222223 | 92.184 |
| 0.8041666666666667 | 92.184 |
| 0.8048611111111111 | 87.692 |
| 0.8055555555555555 | 87.692 |
| 0.80625 | 83.205 |
| 0.8069444444444445 | 83.205 |
| 0.8076388888888889 | 83.205 |
| 0.8083333333333332 | 83.205 |
| 0.8090277777777778 | 78.722 |
| 0.8097222222222222 | 74.246 |
| 0.8104166666666667 | 74.246 |
| 0.811111111111111 | 74.246 |
| 0.8118055555555556 | 74.246 |
| 0.8125 | 74.246 |
| 0.8131944444444444 | 74.246 |
| 0.813888888888889 | 69.775 |
| 0.8145833333333333 | 69.775 |
| 0.8152777777777778 | 69.775 |
| 0.8159722222222222 | 69.775 |
| 0.8166666666666668 | 65.31 |
| 0.8173611111111111 | 65.31 |
| 0.8180555555555555 | 65.31 |
| 0.81875 | 65.31 |
| 0.8194444444444445 | 65.31 |
| 0.8201388888888889 | 60.85 |
| 0.8208333333333333 | 60.85 |
| 0.8215277777777777 | 60.85 |
| 0.8222222222222223 | 60.85 |
| 0.8229166666666666 | 56.398 |
| 0.8236111111111111 | 56.398 |
| 0.8243055555555556 | 56.398 |
| 0.8250000000000001 | 56.398 |
| 0.8256944444444444 | 56.398 |
| 0.8263888888888888 | 56.398 |
| 0.8270833333333334 | 51.951 |
| 0.8277777777777778 | 51.951 |
| 0.8284722222222222 | 51.951 |
| 0.8291666666666666 | 51.951 |
| 0.8298611111111112 | 51.951 |
| 0.8305555555555556 | 47.511 |
| 0.8312499999999999 | 47.511 |
| 0.8319444444444444 | 47.511 |
| 0.8326388888888889 | 47.511 |
| 0.8333333333333334 | 47.511 |
| 0.8340277777777777 | 47.511 |
| 0.8347222222222223 | 47.511 |
| 0.8354166666666667 | 43.079 |
| 0.8361111111111111 | 43.079 |
| 0.8368055555555555 | 38.653 |
| 0.8375 | 38.653 |
| 0.8381944444444445 | 38.653 |
| 0.8388888888888889 | 38.653 |
| 0.8395833333333332 | 34.234 |
| 0.8402777777777778 | 34.234 |
| 0.8409722222222222 | 29.823 |
| 0.8416666666666667 | 29.823 |
| 0.842361111111111 | 29.823 |
| 0.8430555555555556 | 29.823 |
| 0.84375 | 25.419 |
| 0.8444444444444444 | 25.419 |
| 0.845138888888889 | 25.419 |
| 0.8458333333333333 | 21.024 |
| 0.8465277777777778 | 21.024 |
| 0.8472222222222222 | 16.636 |
| 0.8479166666666668 | 16.636 |
| 0.8486111111111111 | 16.636 |
| 0.8493055555555555 | 12.257 |
| 0.85 | 12.257 |
| 0.8506944444444445 | 12.257 |
| 0.8513888888888889 | 12.257 |
| 0.8520833333333333 | 12.257 |
| 0.8527777777777777 | 7.887 |
| 0.8534722222222223 | 7.887 |
| 0.8541666666666666 | 7.887 |
| 0.8548611111111111 | 7.887 |
| 0.8555555555555556 | 7.887 |
| 0.8562500000000001 | 7.887 |
| 0.8569444444444444 | 7.887 |
| 0.8576388888888888 | 3.525 |
| 0.8583333333333334 | 3.525 |
| 0.8590277777777778 | 3.525 |
| 0.8597222222222222 | 3.525 |
| 0.8604166666666666 | 3.525 |
| 0.8611111111111112 | 3.525 |
| 0.8618055555555556 | 3.525 |
| 0.8624999999999999 | 3.525 |
| 0.8631944444444444 | 3.525 |
| 0.8638888888888889 | 0 |
| 0.8645833333333334 | 0 |
| 0.8652777777777777 | 0 |
| 0.8659722222222223 | 0 |
| 0.8666666666666667 | 0 |
| 0.8673611111111111 | 0 |
| 0.8680555555555555 | 0 |
| 0.86875 | 0 |
| 0.8694444444444445 | 0 |
| 0.8701388888888889 | 0 |
| 0.8708333333333332 | 0 |
| 0.8715277777777778 | 0 |
| 0.8722222222222222 | 0 |
| 0.8729166666666667 | 0 |
| 0.873611111111111 | 0 |
| 0.8743055555555556 | 0 |
| 0.875 | 0 |
| 0.8756944444444444 | 0 |
| 0.876388888888889 | 0 |
| 0.8770833333333333 | 0 |
| 0.8777777777777778 | 0 |
| 0.8784722222222222 | 0 |
| 0.8791666666666668 | 0 |
| 0.8798611111111111 | 0 |
| 0.8805555555555555 | 0 |
| 0.88125 | 0 |
| 0.8819444444444445 | 0 |
| 0.8826388888888889 | 0 |
| 0.8833333333333333 | 0 |
| 0.8840277777777777 | 0 |
| 0.8847222222222223 | 0 |
| 0.8854166666666666 | 0 |
| 0.8861111111111111 | 0 |
| 0.8868055555555556 | 0 |
| 0.8875000000000001 | 0 |
| 0.8881944444444444 | 0 |
| 0.8888888888888888 | 0 |
| 0.8895833333333334 | 0 |
| 0.8902777777777778 | 0 |
| 0.8909722222222222 | 0 |
| 0.8916666666666666 | 0 |
| 0.8923611111111112 | 0 |
| 0.8930555555555556 | 0 |
| 0.8937499999999999 | 0 |
| 0.8944444444444444 | 0 |
| 0.8951388888888889 | 0 |
| 0.8958333333333334 | 0 |
| 0.8965277777777777 | 0 |
| 0.8972222222222223 | 0 |
| 0.8979166666666667 | 0 |
| 0.8986111111111111 | 0 |
| 0.8993055555555555 | 0 |
| 0.9 | 0 |
| 0.9006944444444445 | 0 |
| 0.9013888888888889 | 0 |
| 0.9020833333333332 | 0 |
| 0.9027777777777778 | 0 |
| 0.9034722222222222 | 0 |
| 0.9041666666666667 | 0 |
| 0.904861111111111 | 0 |
| 0.9055555555555556 | 0 |
| 0.90625 | 0 |
| 0.9069444444444444 | 0 |
| 0.907638888888889 | 0 |
| 0.9083333333333333 | 0 |
| 0.9090277777777778 | 0 |
| 0.9097222222222222 | 0 |
| 0.9104166666666668 | 0 |
| 0.9111111111111111 | 0 |
| 0.9118055555555555 | 0 |
| 0.9125 | 0 |
| 0.9131944444444445 | 0 |
| 0.9138888888888889 | 0 |
| 0.9145833333333333 | 0 |
| 0.9152777777777777 | 0 |
| 0.9159722222222223 | 0 |
| 0.9166666666666666 | 0 |
| 0.9173611111111111 | 0 |
| 0.9180555555555556 | 0 |
| 0.9187500000000001 | 0 |
| 0.9194444444444444 | 0 |
| 0.9201388888888888 | 0 |
| 0.9208333333333334 | 0 |
| 0.9215277777777778 | 0 |
| 0.9222222222222222 | 0 |
| 0.9229166666666666 | 0 |
| 0.9236111111111112 | 0 |
| 0.9243055555555556 | 0 |
| 0.9249999999999999 | 0 |
| 0.9256944444444444 | 0 |
| 0.9263888888888889 | 0 |
| 0.9270833333333334 | 0 |
| 0.9277777777777777 | 0 |
| 0.9284722222222223 | 0 |
| 0.9291666666666667 | 0 |
| 0.9298611111111111 | 0 |
| 0.9305555555555555 | 0 |
| 0.93125 | 0 |
| 0.9319444444444445 | 0 |
| 0.9326388888888889 | 0 |
| 0.9333333333333332 | 0 |
| 0.9340277777777778 | 0 |
| 0.9347222222222222 | 0 |
| 0.9354166666666667 | 0 |
| 0.936111111111111 | 0 |
| 0.9368055555555556 | 0 |
| 0.9375 | 0 |
| 0.9381944444444444 | 0 |
| 0.938888888888889 | 0 |
| 0.9395833333333333 | 0 |
| 0.9402777777777778 | 0 |
| 0.9409722222222222 | 0 |
| 0.9416666666666668 | 0 |
| 0.9423611111111111 | 0 |
| 0.9430555555555555 | 0 |
| 0.94375 | 0 |
| 0.9444444444444445 | 0 |
| 0.9451388888888889 | 0 |
| 0.9458333333333333 | 0 |
| 0.9465277777777777 | 0 |
| 0.9472222222222223 | 0 |
| 0.9479166666666666 | 0 |
| 0.9486111111111111 | 0 |
| 0.9493055555555556 | 0 |
| 0.9500000000000001 | 0 |
| 0.9506944444444444 | 0 |
| 0.9513888888888888 | 0 |
| 0.9520833333333334 | 0 |
| 0.9527777777777778 | 0 |
| 0.9534722222222222 | 0 |
| 0.9541666666666666 | 0 |
| 0.9548611111111112 | 0 |
| 0.9555555555555556 | 0 |
| 0.9562499999999999 | 0 |
| 0.9569444444444444 | 0 |
| 0.9576388888888889 | 0 |
| 0.9583333333333334 | 0 |
| 0.9590277777777777 | 0 |
| 0.9597222222222223 | 0 |
| 0.9604166666666667 | 0 |
| 0.9611111111111111 | 0 |
| 0.9618055555555555 | 0 |
| 0.9625 | 0 |
| 0.9631944444444445 | 0 |
| 0.9638888888888889 | 0 |
| 0.9645833333333332 | 0 |
| 0.9652777777777778 | 0 |
| 0.9659722222222222 | 0 |
| 0.9666666666666667 | 0 |
| 0.967361111111111 | 0 |
| 0.9680555555555556 | 0 |
| 0.96875 | 0 |
| 0.9694444444444444 | 0 |
| 0.970138888888889 | 0 |
| 0.9708333333333333 | 0 |
| 0.9715277777777778 | 0 |
| 0.9722222222222222 | 0 |
| 0.9729166666666668 | 0 |
| 0.9736111111111111 | 0 |
| 0.9743055555555555 | 0 |
| 0.975 | 0 |
| 0.9756944444444445 | 0 |
| 0.9763888888888889 | 0 |
| 0.9770833333333333 | 0 |
| 0.9777777777777777 | 0 |
| 0.9784722222222223 | 0 |
| 0.9791666666666666 | 0 |
| 0.9798611111111111 | 0 |
| 0.9805555555555556 | 0 |
| 0.9812500000000001 | 0 |
| 0.9819444444444444 | 0 |
| 0.9826388888888888 | 0 |
| 0.9833333333333334 | 0 |
| 0.9840277777777778 | 0 |
| 0.9847222222222222 | 0 |
| 0.9854166666666666 | 0 |
| 0.9861111111111112 | 0 |
| 0.9868055555555556 | 0 |
| 0.9874999999999999 | 0 |
| 0.9881944444444444 | 0 |
| 0.9888888888888889 | 0 |
| 0.9895833333333334 | 0 |
| 0.9902777777777777 | 0 |
| 0.9909722222222223 | 0 |
| 0.9916666666666667 | 0 |
| 0.9923611111111111 | 0 |
| 0.9930555555555555 | 0 |
| 0.99375 | 0 |
| 0.9944444444444445 | 0 |
| 0.9951388888888889 | 0 |
| 0.9958333333333332 | 0 |
| 0.9965277777777778 | 0 |
| 0.9972222222222222 | 0 |
| 0.9979166666666667 | 0 |
| 0.998611111111111 | 0 |
| 0.9993055555555556 | 0 |